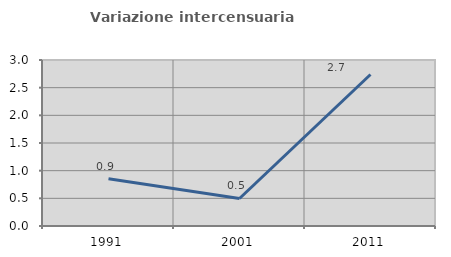
| Category | Variazione intercensuaria annua |
|---|---|
| 1991.0 | 0.855 |
| 2001.0 | 0.497 |
| 2011.0 | 2.738 |